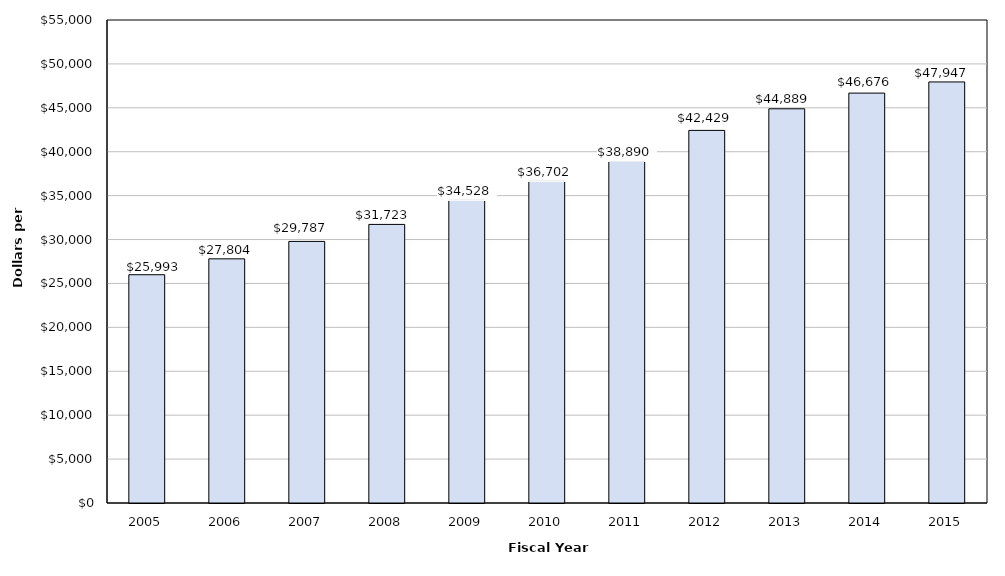
| Category | Tuition and Fees |
|---|---|
| 2005.0 | 25993 |
| 2006.0 | 27804 |
| 2007.0 | 29787 |
| 2008.0 | 31723 |
| 2009.0 | 34528 |
| 2010.0 | 36702 |
| 2011.0 | 38890 |
| 2012.0 | 42429 |
| 2013.0 | 44889 |
| 2014.0 | 46676 |
| 2015.0 | 47947 |